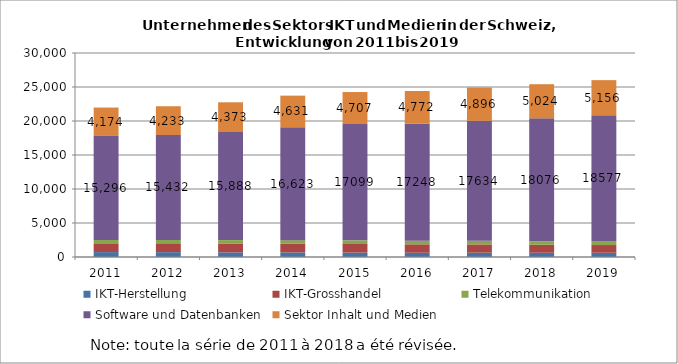
| Category | IKT-Herstellung | IKT-Grosshandel | Telekommunikation | Software und Datenbanken | Sektor Inhalt und Medien |
|---|---|---|---|---|---|
| 2011.0 | 721 | 1292 | 493 | 15296 | 4174 |
| 2012.0 | 711 | 1307 | 490 | 15432 | 4233 |
| 2013.0 | 680 | 1312 | 497 | 15888 | 4373 |
| 2014.0 | 673 | 1271 | 531 | 16623 | 4631 |
| 2015.0 | 651 | 1258 | 544 | 17099 | 4707 |
| 2016.0 | 626 | 1241 | 522 | 17248 | 4772 |
| 2017.0 | 640 | 1212 | 539 | 17634 | 4896 |
| 2018.0 | 629 | 1161 | 521 | 18076 | 5024 |
| 2019.0 | 625 | 1135 | 517 | 18577 | 5156 |